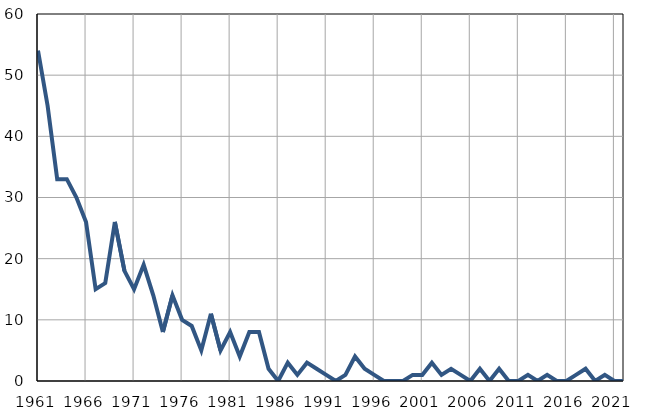
| Category | Infants
deaths |
|---|---|
| 1961.0 | 54 |
| 1962.0 | 45 |
| 1963.0 | 33 |
| 1964.0 | 33 |
| 1965.0 | 30 |
| 1966.0 | 26 |
| 1967.0 | 15 |
| 1968.0 | 16 |
| 1969.0 | 26 |
| 1970.0 | 18 |
| 1971.0 | 15 |
| 1972.0 | 19 |
| 1973.0 | 14 |
| 1974.0 | 8 |
| 1975.0 | 14 |
| 1976.0 | 10 |
| 1977.0 | 9 |
| 1978.0 | 5 |
| 1979.0 | 11 |
| 1980.0 | 5 |
| 1981.0 | 8 |
| 1982.0 | 4 |
| 1983.0 | 8 |
| 1984.0 | 8 |
| 1985.0 | 2 |
| 1986.0 | 0 |
| 1987.0 | 3 |
| 1988.0 | 1 |
| 1989.0 | 3 |
| 1990.0 | 2 |
| 1991.0 | 1 |
| 1992.0 | 0 |
| 1993.0 | 1 |
| 1994.0 | 4 |
| 1995.0 | 2 |
| 1996.0 | 1 |
| 1997.0 | 0 |
| 1998.0 | 0 |
| 1999.0 | 0 |
| 2000.0 | 1 |
| 2001.0 | 1 |
| 2002.0 | 3 |
| 2003.0 | 1 |
| 2004.0 | 2 |
| 2005.0 | 1 |
| 2006.0 | 0 |
| 2007.0 | 2 |
| 2008.0 | 0 |
| 2009.0 | 2 |
| 2010.0 | 0 |
| 2011.0 | 0 |
| 2012.0 | 1 |
| 2013.0 | 0 |
| 2014.0 | 1 |
| 2015.0 | 0 |
| 2016.0 | 0 |
| 2017.0 | 1 |
| 2018.0 | 2 |
| 2019.0 | 0 |
| 2020.0 | 1 |
| 2021.0 | 0 |
| 2022.0 | 0 |